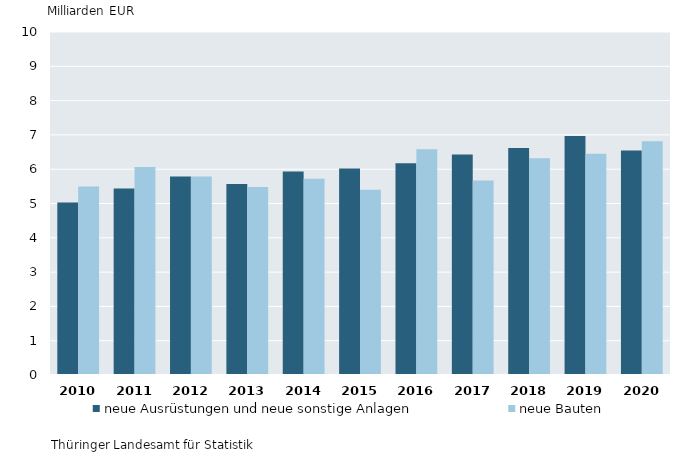
| Category | neue Ausrüstungen und neue sonstige Anlagen | neue Bauten |
|---|---|---|
| 2010.0 | 5.028 | 5.498 |
| 2011.0 | 5.439 | 6.066 |
| 2012.0 | 5.786 | 5.79 |
| 2013.0 | 5.57 | 5.48 |
| 2014.0 | 5.934 | 5.718 |
| 2015.0 | 6.017 | 5.399 |
| 2016.0 | 6.175 | 6.583 |
| 2017.0 | 6.427 | 5.668 |
| 2018.0 | 6.618 | 6.316 |
| 2019.0 | 6.968 | 6.448 |
| 2020.0 | 6.544 | 6.816 |